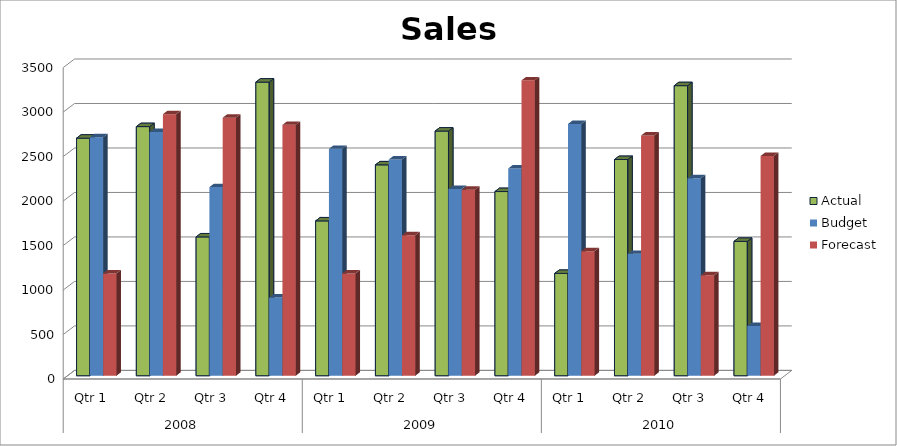
| Category | Actual | Budget | Forecast |
|---|---|---|---|
| 0 | 2670 | 2680 | 1150 |
| 1 | 2800 | 2740 | 2940 |
| 2 | 1560 | 2120 | 2900 |
| 3 | 3300 | 880 | 2820 |
| 4 | 1740 | 2550 | 1150 |
| 5 | 2370 | 2430 | 1580 |
| 6 | 2750 | 2100 | 2090 |
| 7 | 2070 | 2330 | 3320 |
| 8 | 1150 | 2830 | 1400 |
| 9 | 2430 | 1370 | 2700 |
| 10 | 3260 | 2220 | 1130 |
| 11 | 1510 | 560 | 2470 |